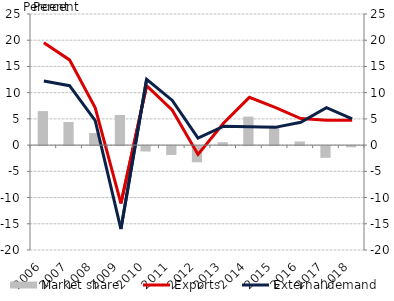
| Category | Market share |
|---|---|
| 2006.0 | 6.485 |
| 2007.0 | 4.412 |
| 2008.0 | 2.301 |
| 2009.0 | 5.76 |
| 2010.0 | -1.028 |
| 2011.0 | -1.7 |
| 2012.0 | -3.081 |
| 2013.0 | 0.56 |
| 2014.0 | 5.435 |
| 2015.0 | 3.7 |
| 2016.0 | 0.697 |
| 2017.0 | -2.232 |
| 2018.0 | -0.223 |